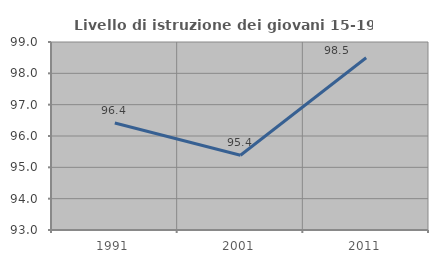
| Category | Livello di istruzione dei giovani 15-19 anni |
|---|---|
| 1991.0 | 96.413 |
| 2001.0 | 95.385 |
| 2011.0 | 98.498 |